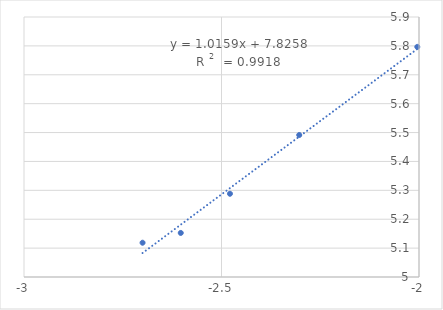
| Category | Series 0 |
|---|---|
| -2.0043213737826426 | 5.797 |
| -2.303196057420489 | 5.492 |
| -2.4785664955938436 | 5.288 |
| -2.603144372620182 | 5.153 |
| -2.699837725867246 | 5.119 |